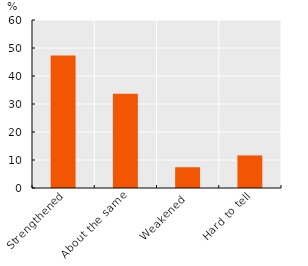
| Category | Series 0 |
|---|---|
| Strengthened | 47.29 |
| About the same | 33.671 |
| Weakened | 7.404 |
| Hard to tell | 11.635 |